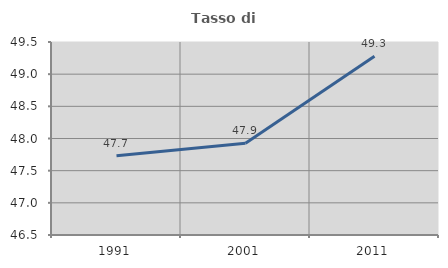
| Category | Tasso di occupazione   |
|---|---|
| 1991.0 | 47.733 |
| 2001.0 | 47.926 |
| 2011.0 | 49.278 |